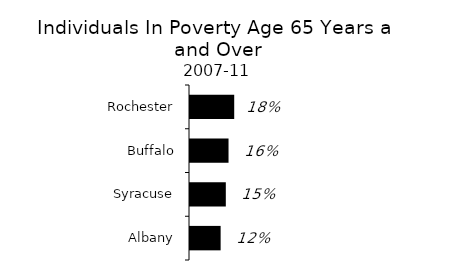
| Category | Series 0 |
|---|---|
| Albany | 0.124 |
| Syracuse | 0.145 |
| Buffalo | 0.156 |
| Rochester | 0.179 |